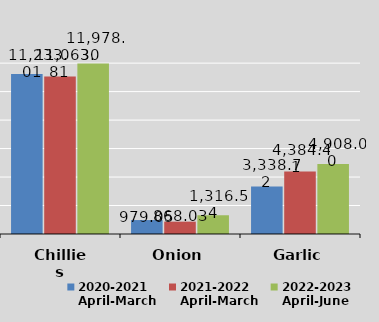
| Category | 2020-2021
April-March
 | 2021-2022
April-March
 | 2022-2023
April-June

 |
|---|---|---|---|
| Chillies | 11233.012 | 11063.807 | 11978.304 |
| Onion | 979.054 | 868.029 | 1316.537 |
| Garlic | 3338.722 | 4384.41 | 4907.995 |